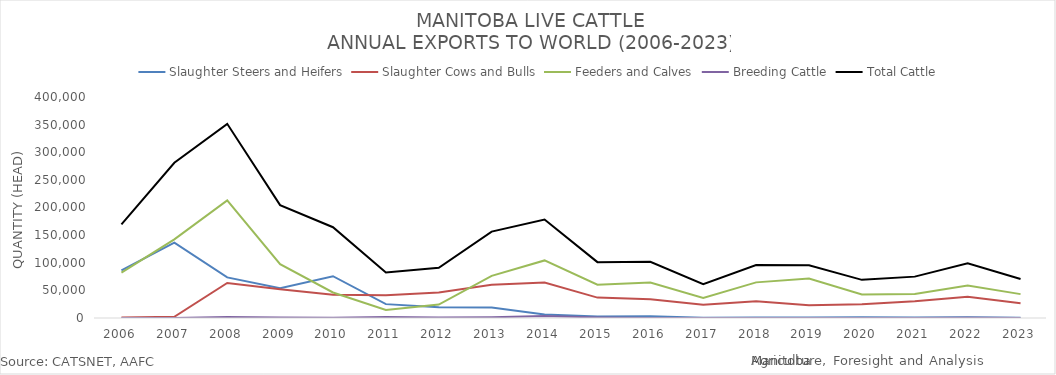
| Category | Slaughter Steers and Heifers | Slaughter Cows and Bulls | Feeders and Calves | Breeding Cattle | Total Cattle |
|---|---|---|---|---|---|
| 2006 | 86319 | 874 | 82178 | 0 | 169371 |
| 2007 | 136365 | 2188 | 142305 | 54 | 280912 |
| 2008 | 73457 | 63293 | 212971 | 1727 | 351448 |
| 2009 | 53889 | 52077 | 97433 | 993 | 204392 |
| 2010 | 75663 | 41989 | 46174 | 478 | 164304 |
| 2011 | 25107 | 41164 | 14370 | 1661 | 82302 |
| 2012 | 19479 | 45953 | 24417 | 972 | 90821 |
| 2013 | 18822 | 60057 | 76197 | 1296 | 156372 |
| 2014 | 6412 | 64114 | 104205 | 3407 | 178138 |
| 2015 | 2763 | 36890 | 60382 | 1087 | 101122 |
| 2016 | 3322 | 34100 | 64361 | 108 | 101891 |
| 2017 | 630 | 23972 | 36395 | 145 | 61142 |
| 2018 | 713 | 30471 | 64486 | 87 | 95757 |
| 2019 | 767 | 23257 | 71555 | 51 | 95630 |
| 2020 | 1512 | 24948 | 42400 | 170 | 69030 |
| 2021 | 796 | 30330 | 43564 | 195 | 74885 |
| 2022 | 1263 | 38559 | 58837 | 301 | 98960 |
| 2023 | 435 | 26822 | 43221 | 213 | 70691 |